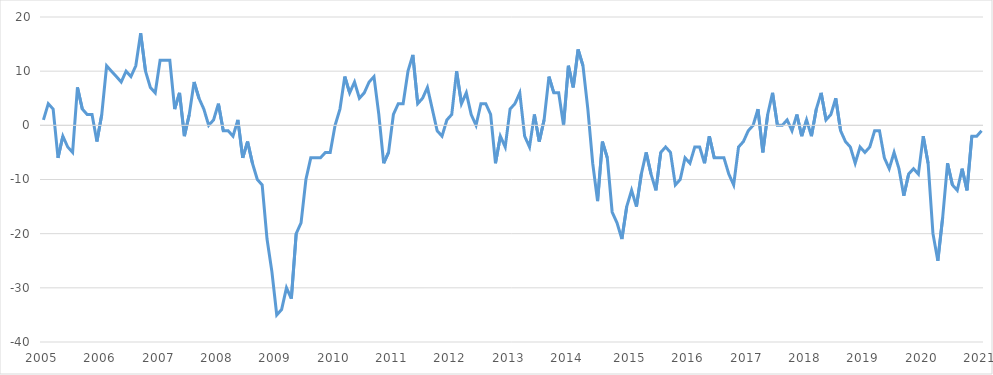
| Category | Sammensat konjunkturbarometer |
|---|---|
| 2005.0 | 1 |
| nan | 4 |
| nan | 3 |
| nan | -6 |
| nan | -2 |
| nan | -4 |
| nan | -5 |
| nan | 7 |
| nan | 3 |
| nan | 2 |
| nan | 2 |
| nan | -3 |
| 2006.0 | 2 |
| nan | 11 |
| nan | 10 |
| nan | 9 |
| nan | 8 |
| nan | 10 |
| nan | 9 |
| nan | 11 |
| nan | 17 |
| nan | 10 |
| nan | 7 |
| nan | 6 |
| 2007.0 | 12 |
| nan | 12 |
| nan | 12 |
| nan | 3 |
| nan | 6 |
| nan | -2 |
| nan | 2 |
| nan | 8 |
| nan | 5 |
| nan | 3 |
| nan | 0 |
| nan | 1 |
| 2008.0 | 4 |
| nan | -1 |
| nan | -1 |
| nan | -2 |
| nan | 1 |
| nan | -6 |
| nan | -3 |
| nan | -7 |
| nan | -10 |
| nan | -11 |
| nan | -21 |
| nan | -27 |
| 2009.0 | -35 |
| nan | -34 |
| nan | -30 |
| nan | -32 |
| nan | -20 |
| nan | -18 |
| nan | -10 |
| nan | -6 |
| nan | -6 |
| nan | -6 |
| nan | -5 |
| nan | -5 |
| 2010.0 | 0 |
| nan | 3 |
| nan | 9 |
| nan | 6 |
| nan | 8 |
| nan | 5 |
| nan | 6 |
| nan | 8 |
| nan | 9 |
| nan | 2 |
| nan | -7 |
| nan | -5 |
| 2011.0 | 2 |
| nan | 4 |
| nan | 4 |
| nan | 10 |
| nan | 13 |
| nan | 4 |
| nan | 5 |
| nan | 7 |
| nan | 3 |
| nan | -1 |
| nan | -2 |
| nan | 1 |
| 2012.0 | 2 |
| nan | 10 |
| nan | 4 |
| nan | 6 |
| nan | 2 |
| nan | 0 |
| nan | 4 |
| nan | 4 |
| nan | 2 |
| nan | -7 |
| nan | -2 |
| nan | -4 |
| 2013.0 | 3 |
| nan | 4 |
| nan | 6 |
| nan | -2 |
| nan | -4 |
| nan | 2 |
| nan | -3 |
| nan | 1 |
| nan | 9 |
| nan | 6 |
| nan | 6 |
| nan | 0 |
| 2014.0 | 11 |
| nan | 7 |
| nan | 14 |
| nan | 11 |
| nan | 3 |
| nan | -7 |
| nan | -14 |
| nan | -3 |
| nan | -6 |
| nan | -16 |
| nan | -18 |
| nan | -21 |
| nan | -15 |
| 2015.0 | -12 |
| nan | -15 |
| nan | -9 |
| nan | -5 |
| nan | -9 |
| nan | -12 |
| nan | -5 |
| nan | -4 |
| nan | -5 |
| nan | -11 |
| nan | -10 |
| nan | -6 |
| 2016.0 | -7 |
| nan | -4 |
| nan | -4 |
| nan | -7 |
| nan | -2 |
| nan | -6 |
| nan | -6 |
| nan | -6 |
| nan | -9 |
| nan | -11 |
| nan | -4 |
| nan | -3 |
| 2017.0 | -1 |
| nan | 0 |
| nan | 3 |
| nan | -5 |
| nan | 2 |
| nan | 6 |
| nan | 0 |
| nan | 0 |
| nan | 1 |
| nan | -1 |
| nan | 2 |
| nan | -2 |
| 2018.0 | 1 |
| nan | -2 |
| nan | 3 |
| nan | 6 |
| nan | 1 |
| nan | 2 |
| nan | 5 |
| nan | -1 |
| nan | -3 |
| nan | -4 |
| nan | -7 |
| nan | -4 |
| 2019.0 | -5 |
| nan | -4 |
| nan | -1 |
| nan | -1 |
| nan | -6 |
| nan | -8 |
| nan | -5 |
| nan | -8 |
| nan | -13 |
| nan | -9 |
| nan | -8 |
| nan | -9 |
| 2020.0 | -2 |
| nan | -7 |
| nan | -20 |
| nan | -25 |
| nan | -17 |
| nan | -7 |
| nan | -11 |
| nan | -12 |
| nan | -8 |
| nan | -12 |
| nan | -2 |
| nan | -2 |
| 2021.0 | -1 |